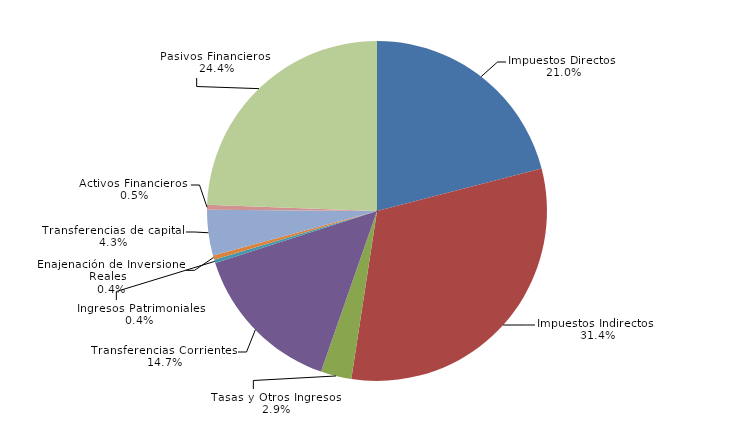
| Category | Series 0 |
|---|---|
| Impuestos Directos   | 2019300.28 |
| Impuestos Indirectos   | 3024755.07 |
| Tasas y Otros Ingresos   | 281405.18 |
| Transferencias Corrientes   | 1414423.23 |
|  Ingresos Patrimoniales   | 32392.44 |
| Enajenación de Inversiones Reales   | 39811.21 |
| Transferencias de capital   | 416783.09 |
| Activos Financieros   | 43639.62 |
| Pasivos Financieros   | 2350141.5 |